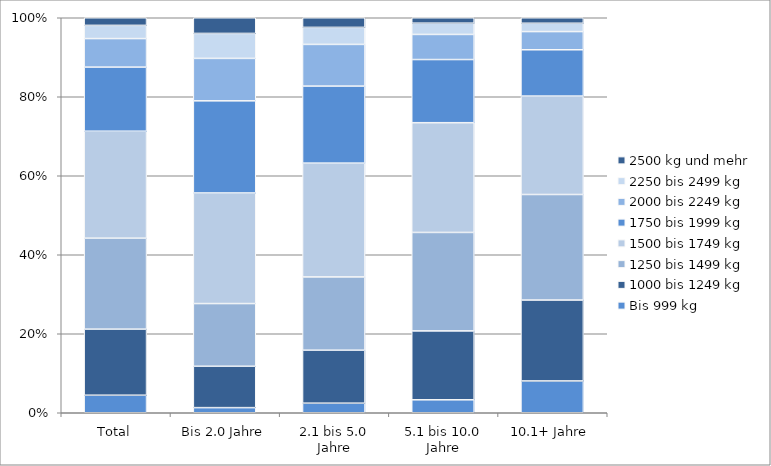
| Category | Bis 999 kg | 1000 bis 1249 kg | 1250 bis 1499 kg | 1500 bis 1749 kg | 1750 bis 1999 kg | 2000 bis 2249 kg | 2250 bis 2499 kg | 2500 kg und mehr |
|---|---|---|---|---|---|---|---|---|
| Total | 1351 | 5090 | 7009 | 8242 | 4939 | 2199 | 1017 | 587 |
| Bis 2.0 Jahre | 48 | 388 | 588 | 1037 | 864 | 398 | 234 | 147 |
| 2.1 bis 5.0 Jahre | 161 | 891 | 1232 | 1914 | 1295 | 701 | 286 | 162 |
| 5.1 bis 10.0 Jahre | 327 | 1739 | 2486 | 2770 | 1594 | 634 | 284 | 137 |
| 10.1+ Jahre | 815 | 2072 | 2703 | 2521 | 1186 | 466 | 213 | 141 |